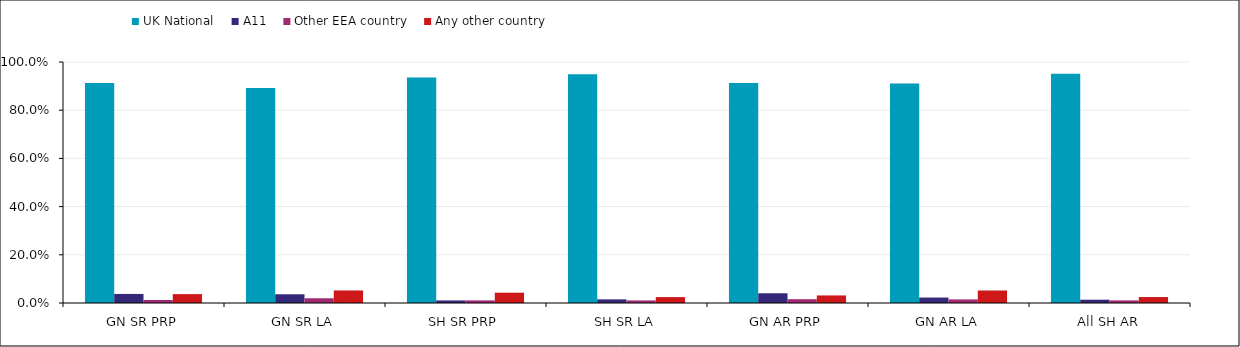
| Category | UK National | A11 | Other EEA country | Any other country |
|---|---|---|---|---|
| GN SR PRP | 0.913 | 0.038 | 0.012 | 0.037 |
| GN SR LA | 0.892 | 0.036 | 0.02 | 0.052 |
| SH SR PRP | 0.936 | 0.011 | 0.011 | 0.043 |
| SH SR LA | 0.95 | 0.015 | 0.011 | 0.025 |
| GN AR PRP | 0.912 | 0.04 | 0.016 | 0.031 |
| GN AR LA | 0.911 | 0.023 | 0.015 | 0.052 |
| All SH AR | 0.951 | 0.014 | 0.011 | 0.025 |